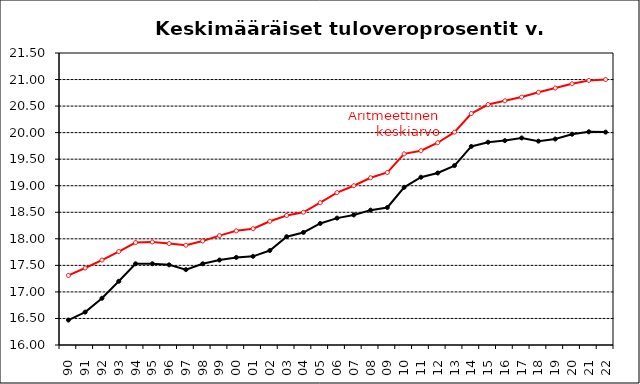
| Category | Series 2 | Series 3 |
|---|---|---|
| 90 | 16.47 | 17.31 |
| 91 | 16.62 | 17.45 |
| 92 | 16.88 | 17.6 |
| 93 | 17.2 | 17.76 |
| 94 | 17.53 | 17.93 |
| 95 | 17.53 | 17.94 |
| 96 | 17.51 | 17.91 |
| 97 | 17.42 | 17.88 |
| 98 | 17.53 | 17.96 |
| 99 | 17.6 | 18.06 |
| 00 | 17.65 | 18.15 |
| 01 | 17.67 | 18.19 |
| 02 | 17.78 | 18.33 |
| 03 | 18.04 | 18.44 |
| 04 | 18.12 | 18.5 |
| 05 | 18.29 | 18.68 |
| 06 | 18.39 | 18.87 |
| 07 | 18.45 | 19 |
| 08 | 18.54 | 19.15 |
| 09 | 18.59 | 19.25 |
| 10 | 18.97 | 19.6 |
| 11 | 19.16 | 19.66 |
| 12 | 19.24 | 19.81 |
| 13 | 19.38 | 20.01 |
| 14 | 19.74 | 20.36 |
| 15 | 19.82 | 20.53 |
| 16 | 19.85 | 20.6 |
| 17 | 19.9 | 20.67 |
| 18 | 19.84 | 20.76 |
| 19 | 19.88 | 20.84 |
| 20 | 19.97 | 20.92 |
| 21 | 20.016 | 20.983 |
| 22 | 20.01 | 21 |